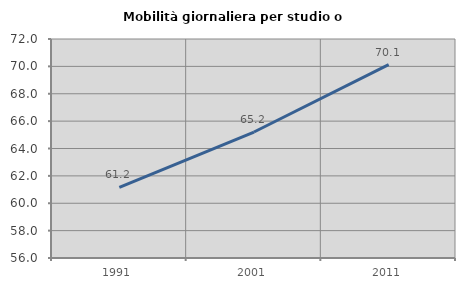
| Category | Mobilità giornaliera per studio o lavoro |
|---|---|
| 1991.0 | 61.158 |
| 2001.0 | 65.204 |
| 2011.0 | 70.126 |